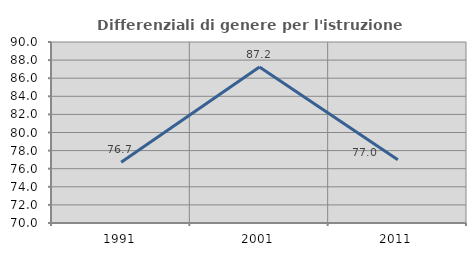
| Category | Differenziali di genere per l'istruzione superiore |
|---|---|
| 1991.0 | 76.705 |
| 2001.0 | 87.228 |
| 2011.0 | 76.989 |